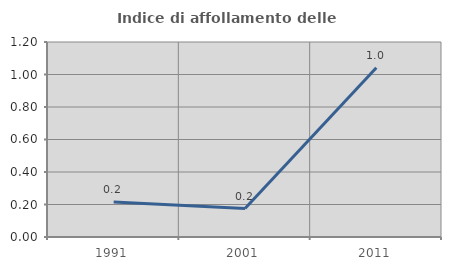
| Category | Indice di affollamento delle abitazioni  |
|---|---|
| 1991.0 | 0.216 |
| 2001.0 | 0.175 |
| 2011.0 | 1.042 |